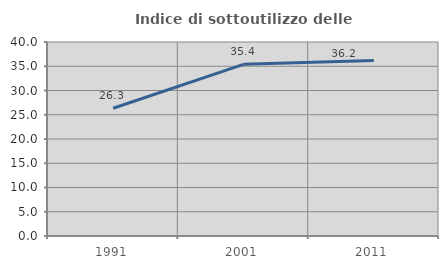
| Category | Indice di sottoutilizzo delle abitazioni  |
|---|---|
| 1991.0 | 26.331 |
| 2001.0 | 35.389 |
| 2011.0 | 36.186 |